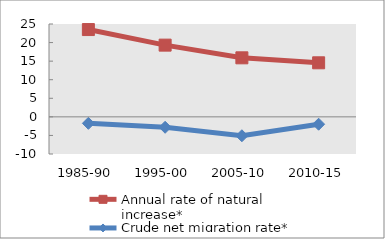
| Category | Annual rate of natural increase* | Crude net migration rate* |
|---|---|---|
| 1985-90 | 23.506 | -1.743 |
| 1995-00 | 19.31 | -2.803 |
| 2005-10 | 15.895 | -5.089 |
| 2010-15 | 14.553 | -1.986 |